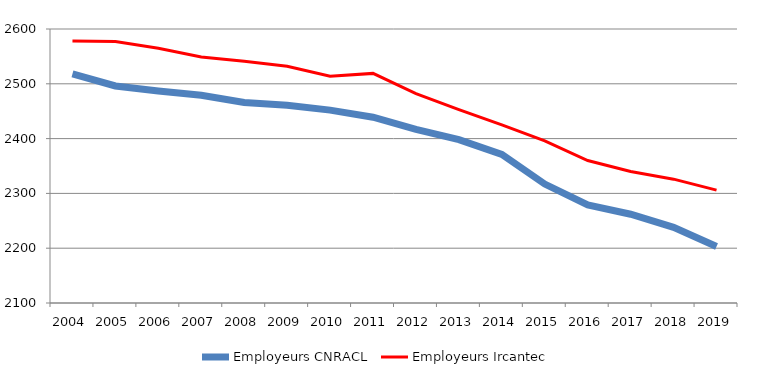
| Category | Employeurs CNRACL | Employeurs Ircantec |
|---|---|---|
| 2004.0 | 2518 | 2578 |
| 2005.0 | 2496 | 2577 |
| 2006.0 | 2487 | 2565 |
| 2007.0 | 2479 | 2549 |
| 2008.0 | 2466 | 2541 |
| 2009.0 | 2461 | 2532 |
| 2010.0 | 2452 | 2514 |
| 2011.0 | 2439 | 2519 |
| 2012.0 | 2417 | 2482 |
| 2013.0 | 2398 | 2453 |
| 2014.0 | 2371 | 2425 |
| 2015.0 | 2317 | 2396 |
| 2016.0 | 2279 | 2360 |
| 2017.0 | 2262 | 2340 |
| 2018.0 | 2238 | 2326 |
| 2019.0 | 2203 | 2306 |